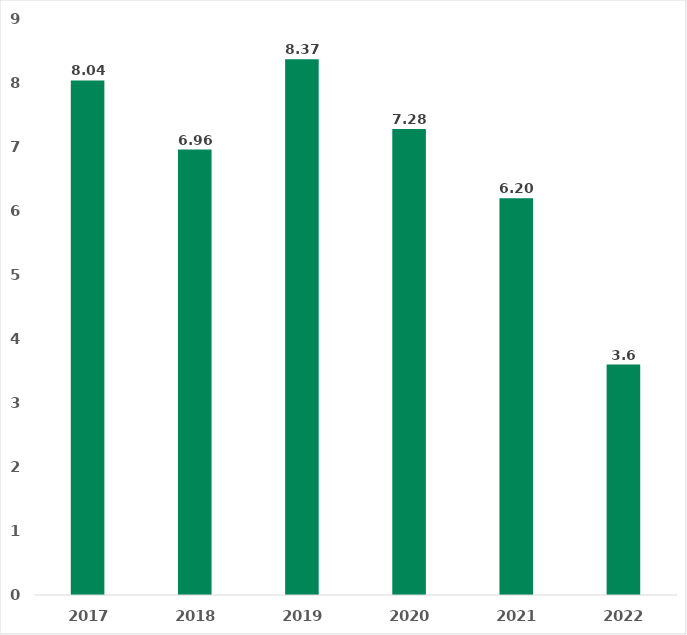
| Category |  Average Length of Stay, days |
|---|---|
| 2017.0 | 8.04 |
| 2018.0 | 6.96 |
| 2019.0 | 8.37 |
| 2020.0 | 7.28 |
| 2021.0 | 6.2 |
| 2022.0 | 3.6 |